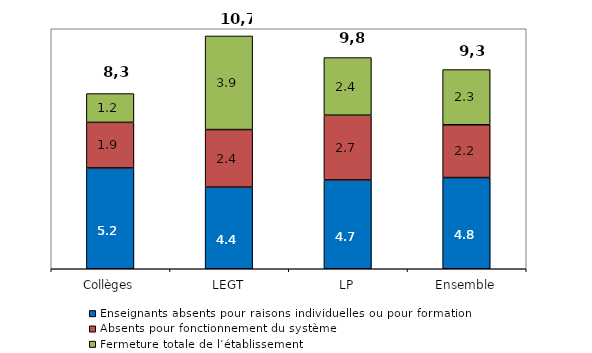
| Category | Enseignants absents pour raisons individuelles ou pour formation | Absents pour fonctionnement du système | Fermeture totale de l’établissement |
|---|---|---|---|
| Collèges | 5.2 | 1.9 | 1.2 |
| LEGT | 4.4 | 2.4 | 3.9 |
| LP | 4.7 | 2.7 | 2.4 |
| Ensemble | 4.8 | 2.2 | 2.3 |